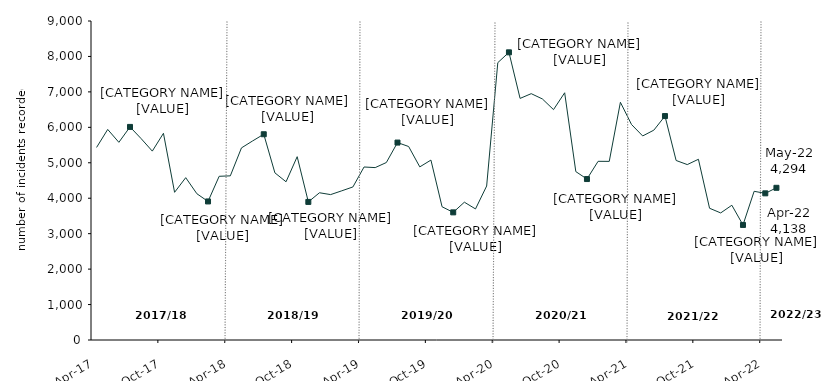
| Category | Series 0 |
|---|---|
| 2017-04-01 | 5433 |
| 2017-05-01 | 5941 |
| 2017-06-01 | 5577 |
| 2017-07-01 | 6012 |
| 2017-08-01 | 5681 |
| 2017-09-01 | 5329 |
| 2017-10-01 | 5832 |
| 2017-11-01 | 4167 |
| 2017-12-01 | 4580 |
| 2018-01-01 | 4127 |
| 2018-02-01 | 3909 |
| 2018-03-01 | 4619 |
| 2018-04-01 | 4631 |
| 2018-05-01 | 5420 |
| 2018-06-01 | 5616 |
| 2018-07-01 | 5805 |
| 2018-08-01 | 4716 |
| 2018-09-01 | 4464 |
| 2018-10-01 | 5172 |
| 2018-11-01 | 3896 |
| 2018-12-01 | 4154 |
| 2019-01-01 | 4102 |
| 2019-02-01 | 4209 |
| 2019-03-01 | 4318 |
| 2019-04-01 | 4881 |
| 2019-05-01 | 4864 |
| 2019-06-01 | 5007 |
| 2019-07-01 | 5570 |
| 2019-08-01 | 5459 |
| 2019-09-01 | 4884 |
| 2019-10-01 | 5076 |
| 2019-11-01 | 3759 |
| 2019-12-01 | 3601 |
| 2020-01-01 | 3888 |
| 2020-02-01 | 3698 |
| 2020-03-01 | 4344 |
| 2020-04-01 | 7825 |
| 2020-05-01 | 8116 |
| 2020-06-01 | 6816 |
| 2020-07-01 | 6950 |
| 2020-08-01 | 6801 |
| 2020-09-01 | 6500 |
| 2020-10-01 | 6975 |
| 2020-11-01 | 4751 |
| 2020-12-01 | 4541 |
| 2021-01-01 | 5041 |
| 2021-02-01 | 5040 |
| 2021-03-01 | 6707 |
| 2021-04-01 | 6079 |
| 2021-05-01 | 5757 |
| 2021-06-01 | 5920 |
| 2021-07-01 | 6318 |
| 2021-08-01 | 5065 |
| 2021-09-01 | 4949 |
| 2021-10-01 | 5099 |
| 2021-11-01 | 3717 |
| 2021-12-01 | 3585 |
| 2022-01-01 | 3802 |
| 2022-02-01 | 3246 |
| 2022-03-01 | 4195 |
| 2022-04-01 | 4138 |
| 2022-05-01 | 4294 |